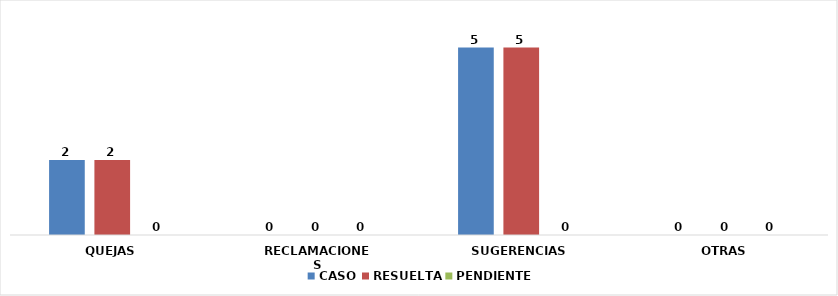
| Category | CASO | RESUELTA | PENDIENTE |
|---|---|---|---|
| QUEJAS | 2 | 2 | 0 |
| RECLAMACIONES | 0 | 0 | 0 |
| SUGERENCIAS | 5 | 5 | 0 |
| OTRAS | 0 | 0 | 0 |